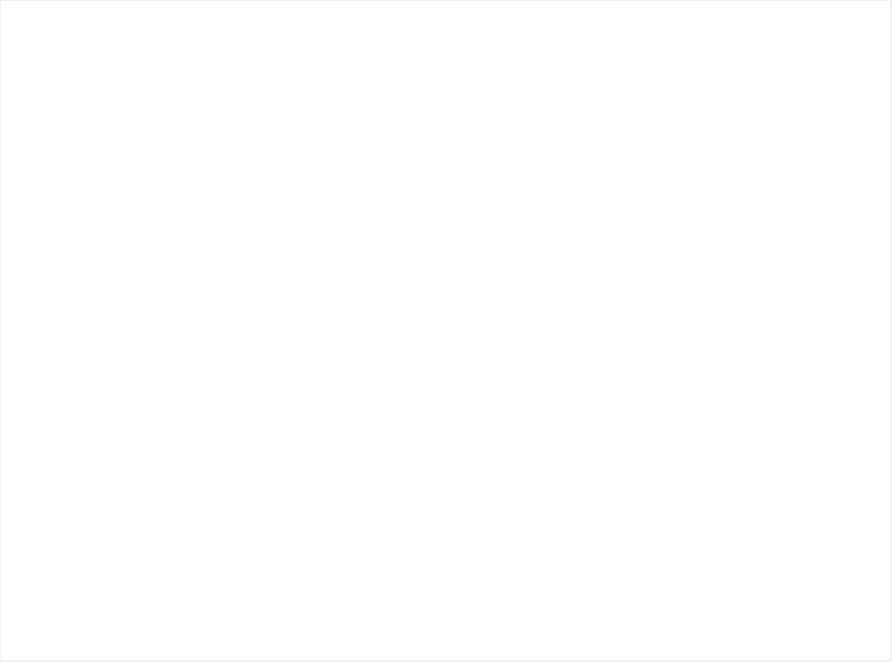
| Category | # of People adopt basic personal and community hygiene practices | # of people access to functioning  sanitation facilities | # of people Equitable and continuous access to sufficient quantity of domestic water |
|---|---|---|---|
| 0 | 4717 | 4129 | 1284.837 |
| 1 | 4859 | 4859 | 4859 |
| 2 | 1895 | 2111 | 2111 |
| 3 | 2111 | 2111 | 2111 |
| 4 | 4892 | 4130 | 4892 |
| 5 | 4892 | 4892 | 4892 |
| 6 | 6936 | 5830 | 6936 |
| 7 | 6936 | 4760 | 6936 |
| 8 | 11625 | 8160 | 11625 |
| 9 | 11625 | 7910 | 11625 |
| 10 | 3360 | 0 | 3360 |
| 11 | 3360 | 500 | 3360 |
| 12 | 979 | 979 | 979 |
| 13 | 971 | 971 | 971 |
| 14 | 6042 | 3930 | 6042 |
| 15 | 6042 | 3930 | 6042 |
| 16 | 3486 | 3486 | 3486 |
| 17 | 3486 | 3486 | 3486 |
| 18 | 4645 | 2074 | 4645 |
| 19 | 4671 | 3114 | 4671 |
| 20 | 4104 | 3023 | 2717.656 |
| 21 | 4676 | 3823 | 4676 |
| 22 | 0 | 581 | 581 |
| 23 | 0 | 581 | 0 |
| 24 | 3095 | 3095 | 3095 |
| 25 | 3095 | 3095 | 3095 |
| 26 | 13302 | 8870 | 13302 |
| 27 | 13302 | 10530 | 13302 |
| 28 | 11487 | 6816 | 11487 |
| 29 | 11487 | 8531 | 11487 |
| 30 | 11564 | 11564 | 11564 |
| 31 | 11564 | 11564 | 11564 |
| 32 | 2805 | 2805 | 2805 |
| 33 | 0 | 2805 | 2805 |
| 34 | 2920 | 2920 | 2920 |
| 35 | 2920 | 2920 | 2920 |
| 36 | 6016 | 4020 | 6016 |
| 37 | 6016 | 3770 | 6016 |
| 38 | 5950 | 5030 | 5950 |
| 39 | 5950 | 5890 | 5950 |
| 40 | 1670 | 800 | 1670 |
| 41 | 1670 | 0 | 1670 |
| 42 | 2186 | 1710 | 2186 |
| 43 | 2186 | 2186 | 2186 |
| 44 | 2248 | 2200 | 2248 |
| 45 | 2248 | 2248 | 2248 |
| 46 | 2285 | 2285 | 2285 |
| 47 | 2285 | 2285 | 2285 |
| 48 | 114 | 100 | 114 |
| 49 | 114 | 0 | 0 |